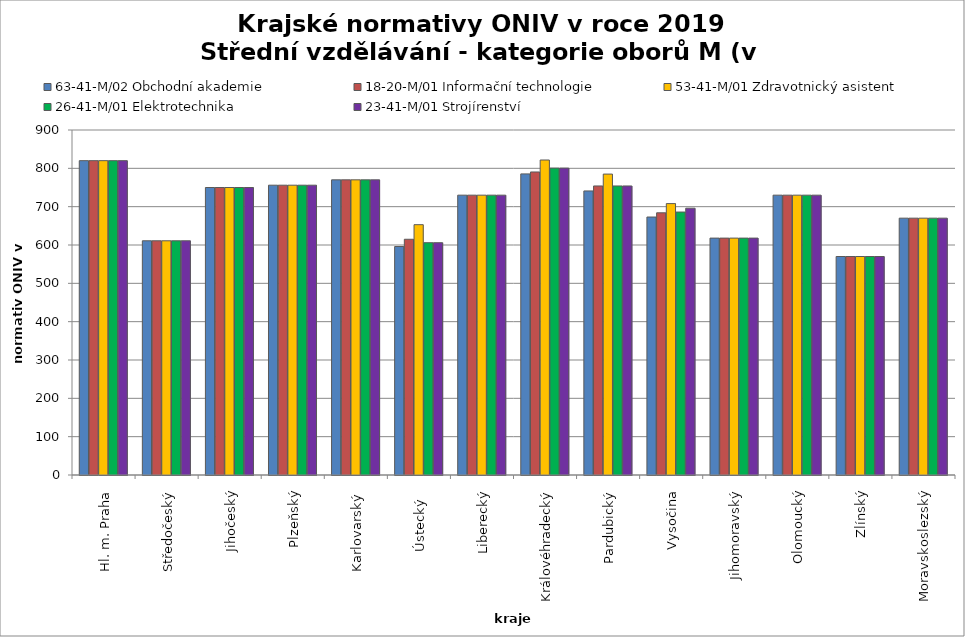
| Category | 63-41-M/02 Obchodní akademie | 18-20-M/01 Informační technologie | 53-41-M/01 Zdravotnický asistent | 26-41-M/01 Elektrotechnika | 23-41-M/01 Strojírenství |
|---|---|---|---|---|---|
| Hl. m. Praha | 820 | 820 | 820 | 820 | 820 |
| Středočeský | 611 | 611 | 611 | 611 | 611 |
| Jihočeský | 750 | 750 | 750 | 750 | 750 |
| Plzeňský | 756 | 756 | 756 | 756 | 756 |
| Karlovarský  | 770 | 770 | 770 | 770 | 770 |
| Ústecký   | 596 | 615 | 653 | 606 | 606 |
| Liberecký | 730 | 730 | 730 | 730 | 730 |
| Královéhradecký | 785.5 | 790.5 | 821.7 | 800.6 | 800.6 |
| Pardubický | 741 | 754 | 785 | 754 | 754 |
| Vysočina | 673 | 684 | 708 | 686 | 696 |
| Jihomoravský | 618 | 618 | 618 | 618 | 618 |
| Olomoucký | 730 | 730 | 730 | 730 | 730 |
| Zlínský | 570 | 570 | 570 | 570 | 570 |
| Moravskoslezský | 670 | 670 | 670 | 670 | 670 |